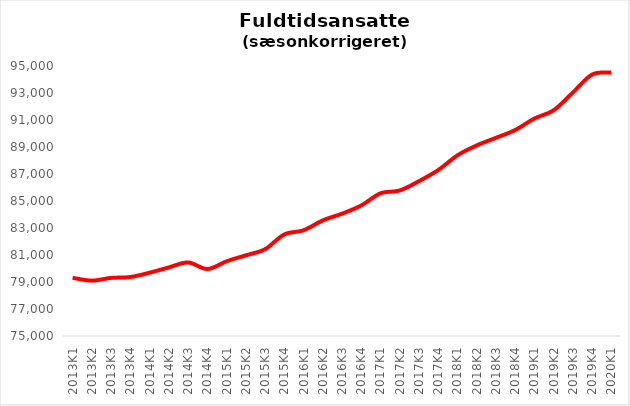
| Category | It-branchen i alt |
|---|---|
| 2013K1 | 79310.318 |
| 2013K2 | 79100.892 |
| 2013K3 | 79303.464 |
| 2013K4 | 79368.764 |
| 2014K1 | 79689.242 |
| 2014K2 | 80078.522 |
| 2014K3 | 80449.511 |
| 2014K4 | 79960.105 |
| 2015K1 | 80533.379 |
| 2015K2 | 80974.832 |
| 2015K3 | 81428.235 |
| 2015K4 | 82521.801 |
| 2016K1 | 82827.398 |
| 2016K2 | 83564.176 |
| 2016K3 | 84058.662 |
| 2016K4 | 84670.038 |
| 2017K1 | 85566.522 |
| 2017K2 | 85780.481 |
| 2017K3 | 86469.76 |
| 2017K4 | 87292.538 |
| 2018K1 | 88382.4 |
| 2018K2 | 89116.581 |
| 2018K3 | 89679.316 |
| 2018K4 | 90254.591 |
| 2019K1 | 91108.827 |
| 2019K2 | 91719.253 |
| 2019K3 | 93036.729 |
| 2019K4 | 94368.655 |
| 2020K1 | 94519.153 |